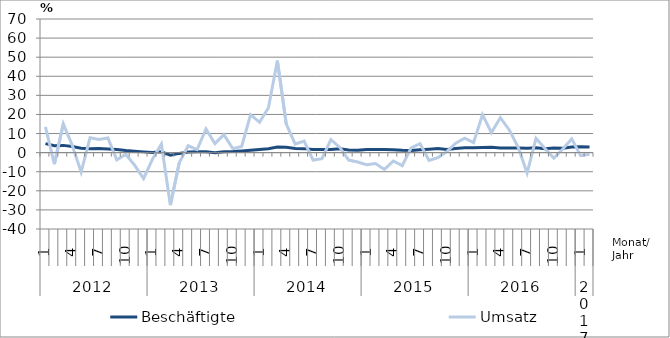
| Category | Beschäftigte | Umsatz |
|---|---|---|
| 0 | 4.7 | 13.5 |
| 1 | 3.6 | -6 |
| 2 | 3.8 | 15.1 |
| 3 | 3.2 | 3.9 |
| 4 | 2.3 | -10.2 |
| 5 | 2.1 | 7.8 |
| 6 | 2.2 | 6.9 |
| 7 | 1.9 | 7.7 |
| 8 | 1.7 | -3.8 |
| 9 | 1.1 | -0.9 |
| 10 | 0.7 | -6.6 |
| 11 | 0.4 | -13.6 |
| 12 | 0.1 | -3.4 |
| 13 | 0.4 | 4.5 |
| 14 | -1.3 | -27.5 |
| 15 | -0.4 | -5.3 |
| 16 | 0.3 | 3.6 |
| 17 | 0.4 | 1.6 |
| 18 | 0.4 | 12.4 |
| 19 | 0 | 4.7 |
| 20 | 0.5 | 9.4 |
| 21 | 0.6 | 2.1 |
| 22 | 0.9 | 3.2 |
| 23 | 1.2 | 19.9 |
| 24 | 1.6 | 15.9 |
| 25 | 2 | 23.5 |
| 26 | 2.9 | 48.2 |
| 27 | 2.8 | 14.9 |
| 28 | 2.2 | 4.5 |
| 29 | 2.1 | 6 |
| 30 | 1.6 | -3.9 |
| 31 | 1.6 | -3.2 |
| 32 | 1.6 | 6.8 |
| 33 | 2 | 2.7 |
| 34 | 1.4 | -3.9 |
| 35 | 1.3 | -4.9 |
| 36 | 1.7 | -6.3 |
| 37 | 1.7 | -5.7 |
| 38 | 1.7 | -8.8 |
| 39 | 1.5 | -4.4 |
| 40 | 1.2 | -6.8 |
| 41 | 1.1 | 2.5 |
| 42 | 1.5 | 4.7 |
| 43 | 1.8 | -4.1 |
| 44 | 2.1 | -2.6 |
| 45 | 1.6 | 0.5 |
| 46 | 2.2 | 4.9 |
| 47 | 2.6 | 7.6 |
| 48 | 2.5 | 5.3 |
| 49 | 2.7 | 19.9 |
| 50 | 2.8 | 10.5 |
| 51 | 2.4 | 18.3 |
| 52 | 2.4 | 11.9 |
| 53 | 2.4 | 2.8 |
| 54 | 2.3 | -10.7 |
| 55 | 2.5 | 7.5 |
| 56 | 2 | 2.2 |
| 57 | 2.4 | -2.9 |
| 58 | 2.3 | 1.9 |
| 59 | 2.9 | 7.2 |
| 60 | 3.1 | -1.6 |
| 61 | 3 | -0.8 |